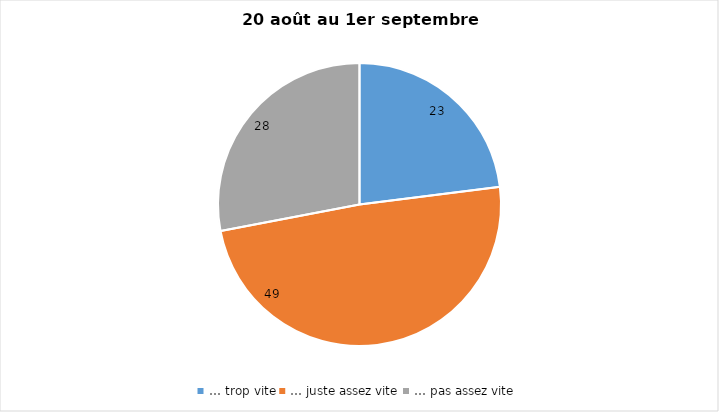
| Category | Series 0 |
|---|---|
| … trop vite | 23 |
| … juste assez vite | 49 |
| … pas assez vite | 28 |